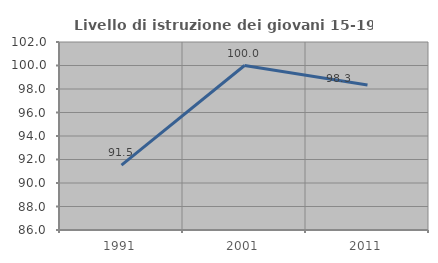
| Category | Livello di istruzione dei giovani 15-19 anni |
|---|---|
| 1991.0 | 91.525 |
| 2001.0 | 100 |
| 2011.0 | 98.333 |